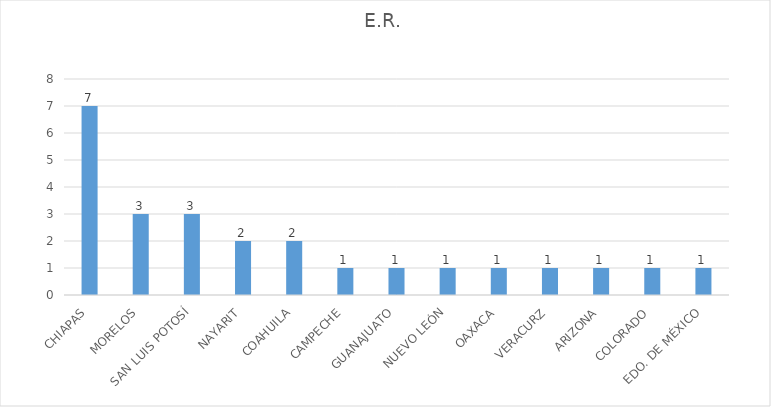
| Category | E.R. |
|---|---|
| CHIAPAS | 7 |
| MORELOS | 3 |
| SAN LUIS POTOSÍ | 3 |
| NAYARIT | 2 |
| COAHUILA | 2 |
| CAMPECHE | 1 |
| GUANAJUATO | 1 |
| NUEVO LEÓN | 1 |
| OAXACA | 1 |
| VERACURZ | 1 |
| ARIZONA | 1 |
| COLORADO | 1 |
| EDO. DE MÉXICO | 1 |